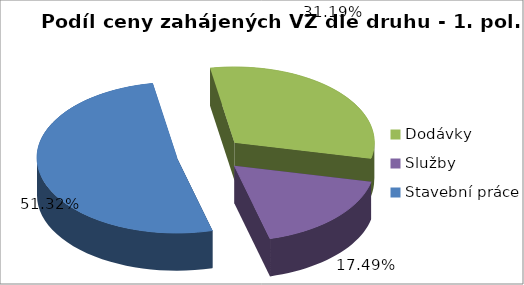
| Category | Series 0 |
|---|---|
| Dodávky | 37135.588 |
| Služby | 20830.327 |
| Stavební práce | 61109.989 |